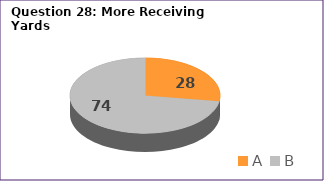
| Category | Series 0 |
|---|---|
| A | 28 |
| B | 74 |